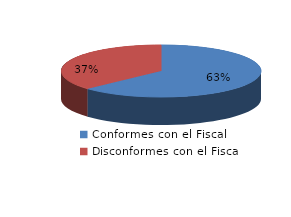
| Category | Series 0 |
|---|---|
| 0 | 5683 |
| 1 | 3327 |